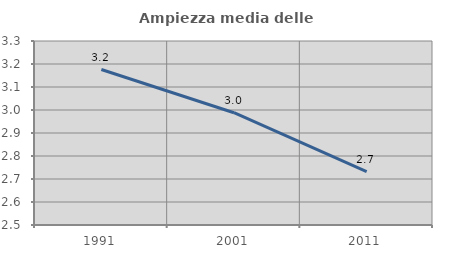
| Category | Ampiezza media delle famiglie |
|---|---|
| 1991.0 | 3.176 |
| 2001.0 | 2.988 |
| 2011.0 | 2.732 |